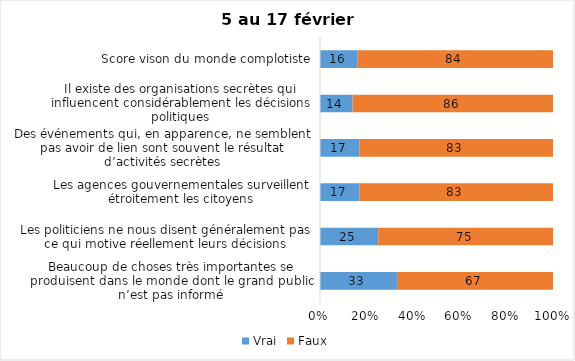
| Category | Vrai | Faux |
|---|---|---|
| Beaucoup de choses très importantes se produisent dans le monde dont le grand public n’est pas informé | 33 | 67 |
| Les politiciens ne nous disent généralement pas ce qui motive réellement leurs décisions | 25 | 75 |
| Les agences gouvernementales surveillent étroitement les citoyens | 17 | 83 |
| Des événements qui, en apparence, ne semblent pas avoir de lien sont souvent le résultat d’activités secrètes | 17 | 83 |
| Il existe des organisations secrètes qui influencent considérablement les décisions politiques | 14 | 86 |
| Score vison du monde complotiste | 16 | 84 |